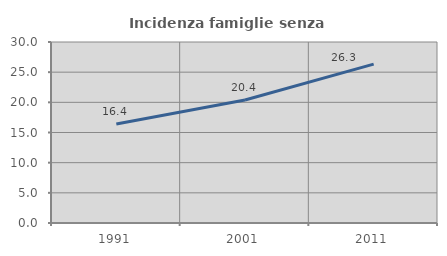
| Category | Incidenza famiglie senza nuclei |
|---|---|
| 1991.0 | 16.412 |
| 2001.0 | 20.398 |
| 2011.0 | 26.333 |